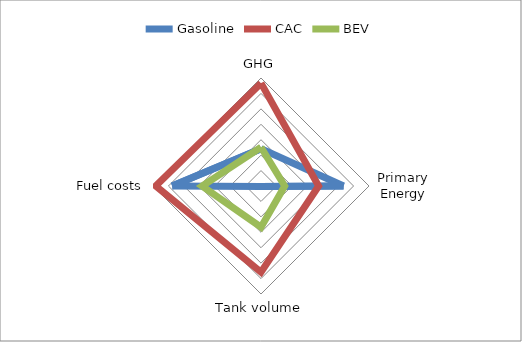
| Category | Gasoline | CAC | BEV |
|---|---|---|---|
| GHG | 4.826 | 13.332 | 5.022 |
| Primary Energy | 10.703 | 7.471 | 3.072 |
| Tank volume | 0.052 | 11.16 | 5.345 |
| Fuel costs | 11.514 | 13.65 | 7.634 |